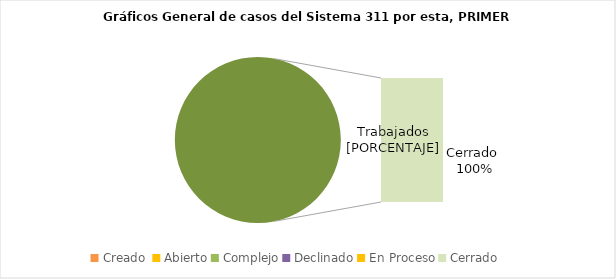
| Category | Series 0 |
|---|---|
| Creado  | 0 |
| Abierto | 0 |
| Complejo | 0 |
| Declinado | 0 |
| En Proceso | 0 |
| Cerrado  | 3 |